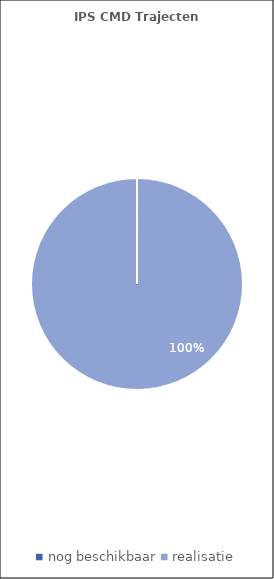
| Category | Series 0 |
|---|---|
| nog beschikbaar | 0 |
| realisatie | 75 |